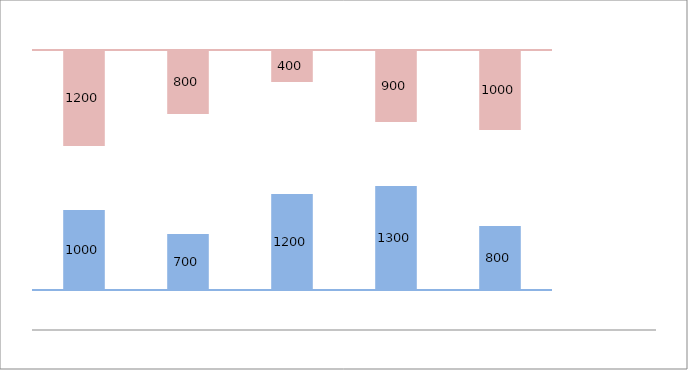
| Category | White 1 | Lower columns | White 2 | Upper columns |
|---|---|---|---|---|
| 2010.0 | 500 | 1000 | 800 | 1200 |
| 2011.0 | 500 | 700 | 1500 | 800 |
| 2012.0 | 500 | 1200 | 1400 | 400 |
| 2013.0 | 500 | 1300 | 800 | 900 |
| 2014.0 | 500 | 800 | 1200 | 1000 |